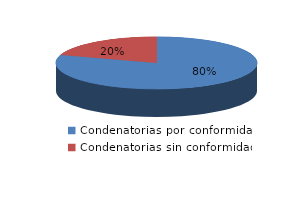
| Category | Series 0 |
|---|---|
| 0 | 1422 |
| 1 | 358 |